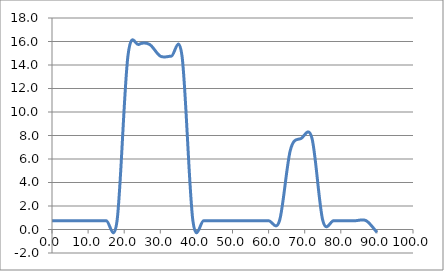
| Category | Elevation (in.) |
|---|---|
| 0.024 | 0.75 |
| 3.024 | 0.75 |
| 6.024 | 0.75 |
| 9.024000000000001 | 0.75 |
| 12.024000000000001 | 0.75 |
| 15.024000000000001 | 0.75 |
| 18.024 | 0.75 |
| 21.024 | 14.75 |
| 24.023999999999997 | 15.75 |
| 27.023999999999997 | 15.75 |
| 30.023999999999997 | 14.75 |
| 33.024 | 14.75 |
| 36.024 | 14.75 |
| 39.024 | 0.75 |
| 42.024 | 0.75 |
| 45.024 | 0.75 |
| 48.024 | 0.75 |
| 51.024 | 0.75 |
| 54.024 | 0.75 |
| 57.024 | 0.75 |
| 60.024 | 0.75 |
| 63.024 | 0.75 |
| 66.024 | 6.75 |
| 69.024 | 7.75 |
| 72.024 | 7.75 |
| 75.024 | 0.75 |
| 78.024 | 0.75 |
| 81.024 | 0.75 |
| 84.024 | 0.75 |
| 87.024 | 0.75 |
| 90.024 | -0.25 |